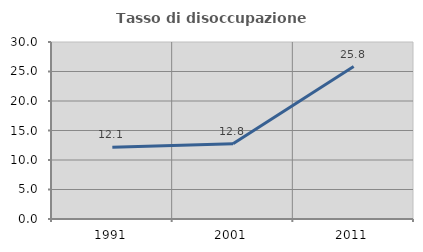
| Category | Tasso di disoccupazione giovanile  |
|---|---|
| 1991.0 | 12.143 |
| 2001.0 | 12.766 |
| 2011.0 | 25.843 |